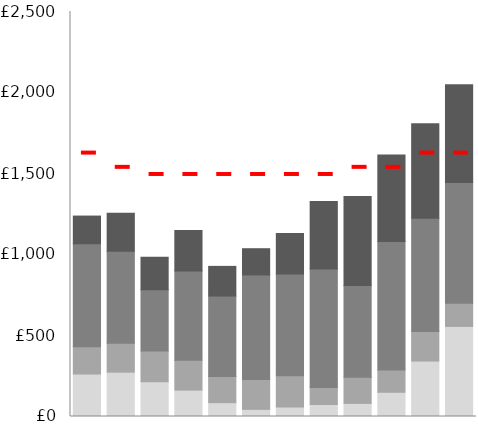
| Category | Donuts | Danish | Coffee | Tea |
|---|---|---|---|---|
| Jan | 262.24 | 168 | 636 | 171 |
| Feb | 273.68 | 179.2 | 567 | 234 |
| Mar | 213.84 | 190.4 | 378 | 201 |
| Apr | 162.8 | 184.8 | 550 | 250.5 |
| May | 85.36 | 161.28 | 497 | 183 |
| Jun | 44 | 184.8 | 645 | 162 |
| Jul | 58.96 | 192.64 | 628 | 250.5 |
| Aug | 73.92 | 105.28 | 731 | 417 |
| Sep | 80.96 | 161.28 | 566 | 550.5 |
| Oct | 149.6 | 137.76 | 793 | 534 |
| Nov | 342.32 | 182.56 | 699 | 583.5 |
| Dec | 556.16 | 143.36 | 745 | 603 |